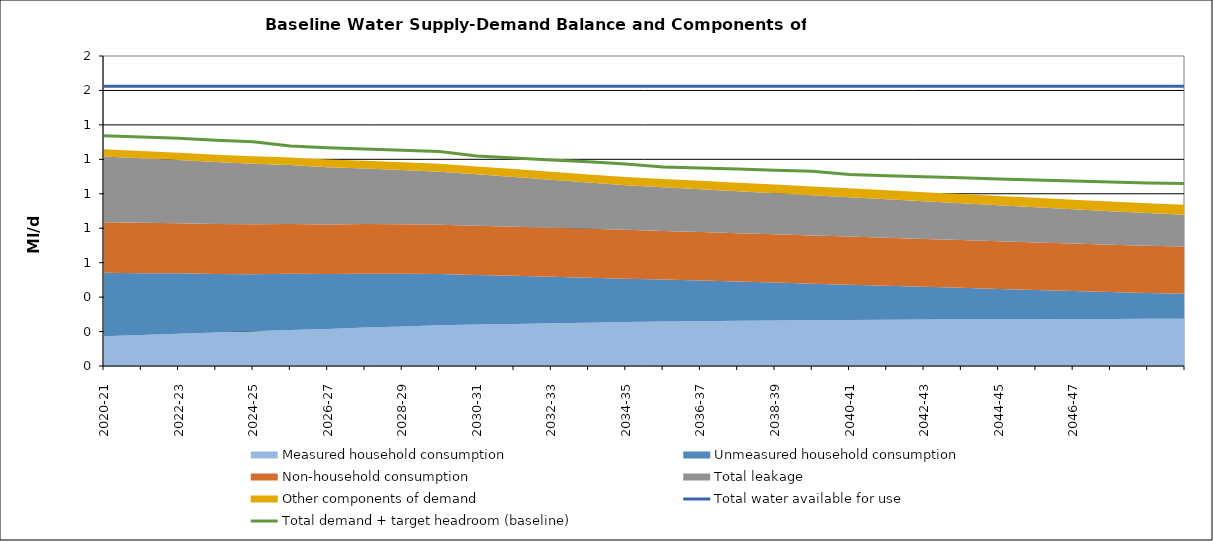
| Category | Total water available for use | Total demand + target headroom (baseline) |
|---|---|---|
| 2020-21 | 1.625 | 1.338 |
| 2021-22 | 1.625 | 1.329 |
| 2022-23 | 1.625 | 1.322 |
| 2023-24 | 1.625 | 1.311 |
| 2024-25 | 1.625 | 1.302 |
| 2025-26 | 1.625 | 1.278 |
| 2026-27 | 1.625 | 1.267 |
| 2027-28 | 1.625 | 1.261 |
| 2028-29 | 1.625 | 1.253 |
| 2029-30 | 1.625 | 1.245 |
| 2030-31 | 1.625 | 1.22 |
| 2031-32 | 1.625 | 1.208 |
| 2032-33 | 1.625 | 1.196 |
| 2033-34 | 1.625 | 1.185 |
| 2034-35 | 1.625 | 1.173 |
| 2035-36 | 1.625 | 1.156 |
| 2036-37 | 1.625 | 1.149 |
| 2037-38 | 1.625 | 1.144 |
| 2038-39 | 1.625 | 1.137 |
| 2039-40 | 1.625 | 1.13 |
| 2040-41 | 1.625 | 1.111 |
| 2041-42 | 1.625 | 1.105 |
| 2042-43 | 1.625 | 1.099 |
| 2043-44 | 1.625 | 1.092 |
| 2044-45 | 1.625 | 1.085 |
| 2045-46 | 1.625 | 1.08 |
| 2046-47 | 1.625 | 1.074 |
| 2047-48 | 1.625 | 1.068 |
| 2048-49 | 1.625 | 1.063 |
| 2049-50 | 1.625 | 1.059 |